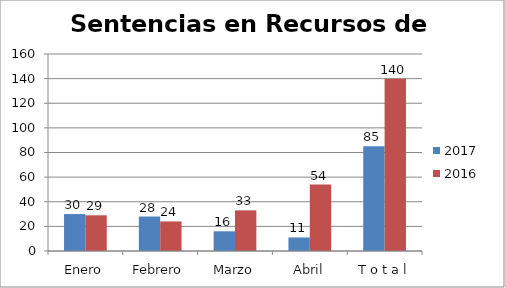
| Category | 2017 | 2016 |
|---|---|---|
| Enero | 30 | 29 |
| Febrero | 28 | 24 |
| Marzo | 16 | 33 |
| Abril | 11 | 54 |
| T o t a l | 85 | 140 |